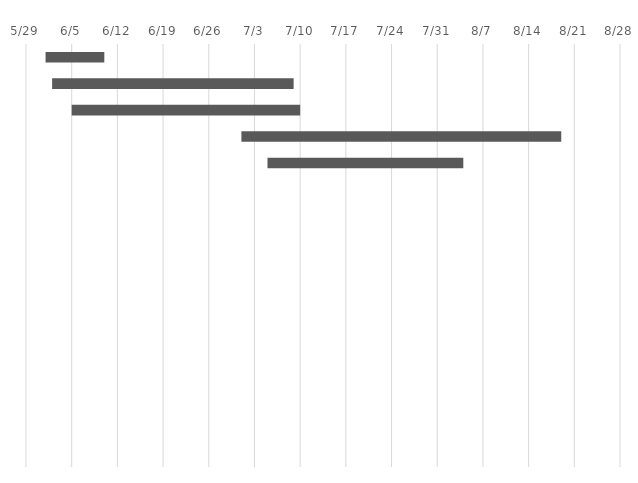
| Category | START DATE | DURATION
(Days) |
|---|---|---|
| Negotiate project costs | 6/1/20 | 9 |
| Consult regulatory specialists | 6/2/20 | 37 |
| Enter Task 3 | 6/5/20 | 35 |
| Enter Task 4 | 7/1/20 | 49 |
| Enter Task 5 | 7/5/20 | 30 |